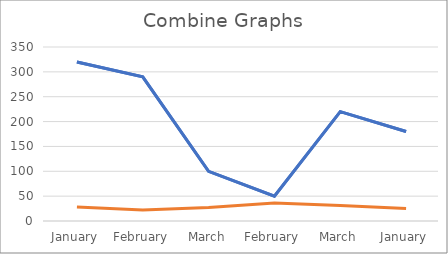
| Category | Age | Total Sale |
|---|---|---|
| January | 28 | 320 |
| February | 22 | 290 |
| March | 27 | 100 |
| February | 36 | 50 |
| March | 31 | 220 |
| January | 25 | 180 |